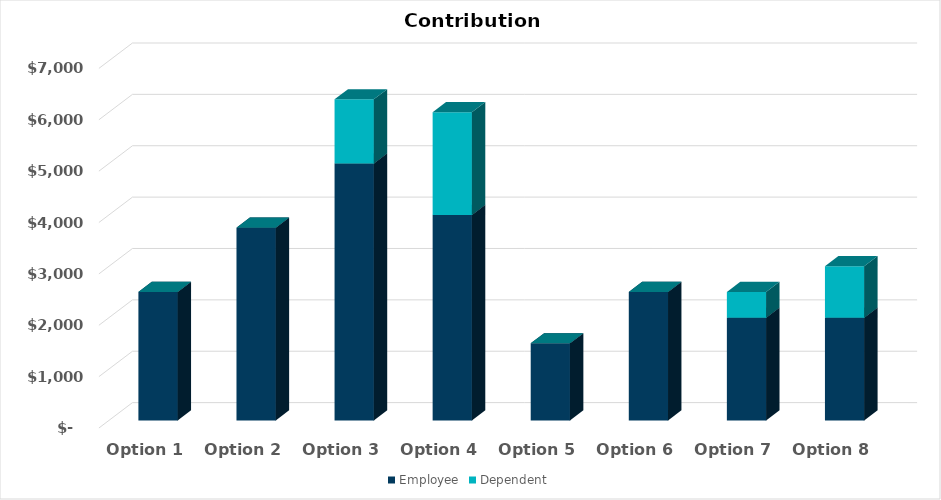
| Category | Employee | Dependent |
|---|---|---|
| Option 1 | 2500 | 0 |
| Option 2 | 3750 | 0 |
| Option 3 | 5000 | 1250 |
| Option 4 | 4000 | 2000 |
| Option 5 | 1500 | 0 |
| Option 6 | 2500 | 0 |
| Option 7 | 2000 | 500 |
| Option 8 | 2000 | 1000 |